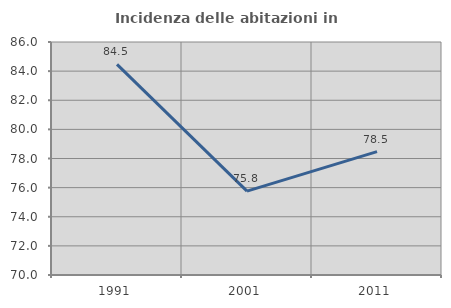
| Category | Incidenza delle abitazioni in proprietà  |
|---|---|
| 1991.0 | 84.462 |
| 2001.0 | 75.761 |
| 2011.0 | 78.475 |